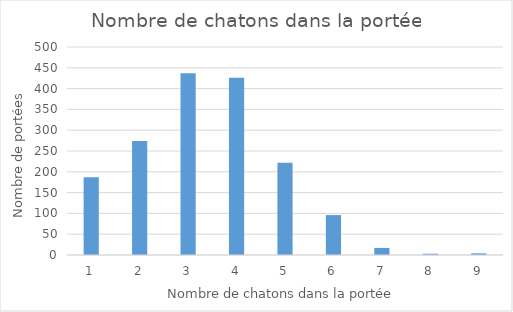
| Category | Series 0 |
|---|---|
| 1.0 | 187 |
| 2.0 | 274 |
| 3.0 | 437 |
| 4.0 | 426 |
| 5.0 | 222 |
| 6.0 | 96 |
| 7.0 | 17 |
| 8.0 | 3 |
| 9.0 | 4 |